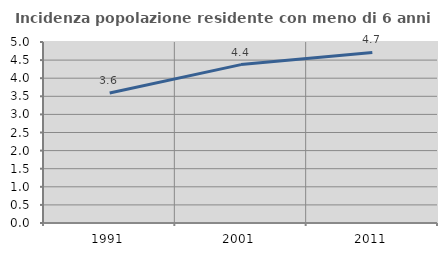
| Category | Incidenza popolazione residente con meno di 6 anni |
|---|---|
| 1991.0 | 3.591 |
| 2001.0 | 4.376 |
| 2011.0 | 4.713 |